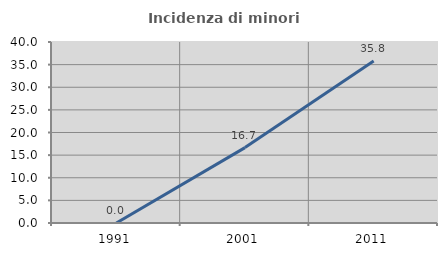
| Category | Incidenza di minori stranieri |
|---|---|
| 1991.0 | 0 |
| 2001.0 | 16.667 |
| 2011.0 | 35.789 |